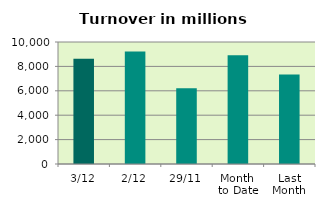
| Category | Series 0 |
|---|---|
| 3/12 | 8618.91 |
| 2/12 | 9222.632 |
| 29/11 | 6219.132 |
| Month 
to Date | 8920.771 |
| Last
Month | 7326.344 |